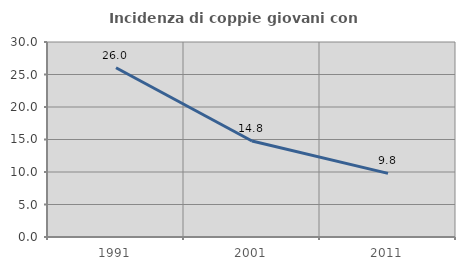
| Category | Incidenza di coppie giovani con figli |
|---|---|
| 1991.0 | 26.045 |
| 2001.0 | 14.768 |
| 2011.0 | 9.794 |